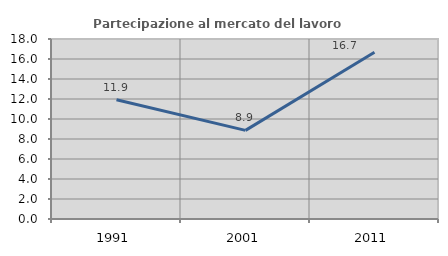
| Category | Partecipazione al mercato del lavoro  femminile |
|---|---|
| 1991.0 | 11.927 |
| 2001.0 | 8.861 |
| 2011.0 | 16.667 |